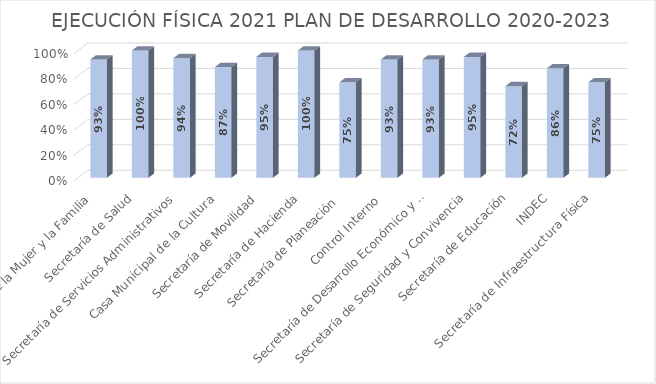
| Category | EJECUCIÓN FÍSICA 2021 PLAN DE DESARROLLO 2020-2023 |
|---|---|
| Secretaría de la Mujer y la Familia | 0.93 |
| Secretaría de Salud | 1 |
| Secretaría de Servicios Administrativos | 0.94 |
| Casa Municipal de la Cultura | 0.87 |
| Secretaría de Movilidad | 0.95 |
| Secretaría de Hacienda | 1 |
| Secretaría de Planeación  | 0.75 |
| Control Interno  | 0.93 |
| Secretaría de Desarrollo Económico y social | 0.93 |
| Secretaría de Seguridad y Convivencia | 0.95 |
| Secretaría de Educación | 0.72 |
| INDEC | 0.86 |
| Secretaría de Infraestructura Física | 0.75 |